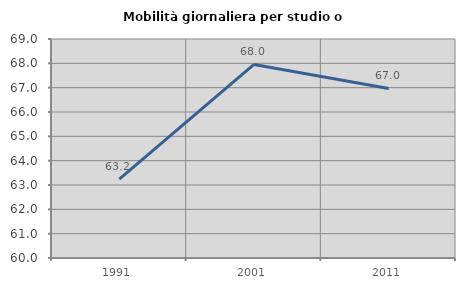
| Category | Mobilità giornaliera per studio o lavoro |
|---|---|
| 1991.0 | 63.238 |
| 2001.0 | 67.953 |
| 2011.0 | 66.97 |